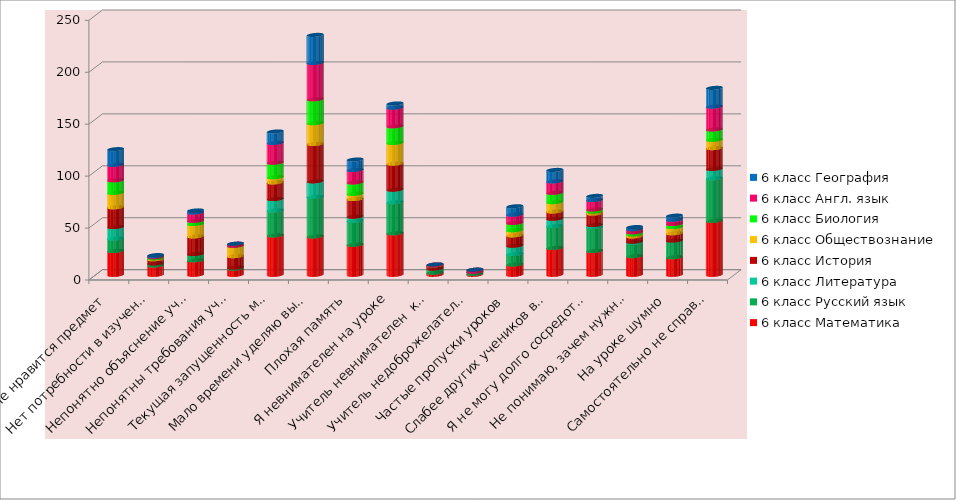
| Category | 6 класс Математика | 6 класс Русский язык | 6 класс Литература | 6 класс История | 6 класс Обществознание | 6 класс Биология | 6 класс Англ. язык | 6 класс География |
|---|---|---|---|---|---|---|---|---|
| Не нравится предмет | 23 | 12 | 11 | 19 | 14 | 12 | 15 | 15 |
| Нет потребности в изучении предмета | 9 | 2 | 0 | 4 | 1 | 1 | 1 | 1 |
| Непонятно объяснение учителя | 14 | 6 | 0 | 17 | 12 | 3 | 8 | 2 |
| Непонятны требования учителя | 6 | 1 | 0 | 11 | 10 | 0 | 2 | 0 |
| Текущая запущенность материала из-за лени | 38 | 24 | 11 | 16 | 5 | 14 | 19 | 11 |
| Мало времени уделяю выполнению д/з | 37 | 38 | 15 | 36 | 20 | 23 | 35 | 27 |
| Плохая память | 29 | 23 | 4 | 17 | 5 | 11 | 12 | 10 |
| Я невнимателен на уроке | 40 | 30 | 12 | 25 | 20 | 16 | 18 | 4 |
| Учитель невнимателен  ко мне | 2 | 4 | 0 | 3 | 0 | 0 | 1 | 0 |
| Учитель недоброжелателен ко мне | 1 | 2 | 0 | 0 | 0 | 0 | 2 | 0 |
| Частые пропуски уроков | 10 | 10 | 8 | 10 | 5 | 7 | 8 | 8 |
| Слабее других учеников в классе | 26 | 21 | 7 | 7 | 9 | 9 | 11 | 11 |
| Я не могу долго сосредоточивать внимание | 23 | 23 | 2 | 11 | 2 | 2 | 9 | 4 |
| Не понимаю, зачем нужны  эти знания | 18 | 13 | 1 | 5 | 2 | 2 | 3 | 2 |
| На уроке шумно | 17 | 16 | 0 | 7 | 6 | 3 | 4 | 4 |
| Самостоятельно не справляюсь  – нужна помощь  | 52 | 41 | 9 | 20 | 8 | 10 | 22 | 18 |